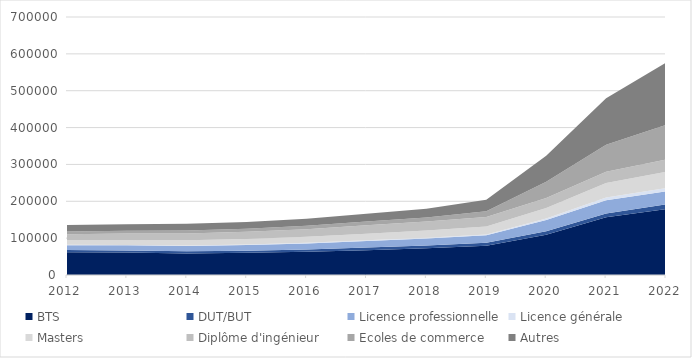
| Category | BTS | DUT/BUT | Licence professionnelle | Licence générale | Masters | Diplôme d'ingénieur | Ecoles de commerce | Autres |
|---|---|---|---|---|---|---|---|---|
| 2012 | 61769 | 5887 | 13387 | 1135 | 12676 | 15856 | 7310 | 17351 |
| 2013 | 60834 | 5836 | 13853 | 1182 | 13441 | 17351 | 7643 | 17872 |
| 2014 | 58620 | 5799 | 14452 | 1378 | 13784 | 18620 | 8305 | 17818 |
| 2015 | 60095 | 5918 | 15137 | 1475 | 14907 | 19620 | 8648 | 18213 |
| 2016 | 62830 | 6378 | 16041 | 2081 | 16165 | 20901 | 9379 | 18679 |
| 2017 | 67401 | 6900 | 17687 | 2322 | 17816 | 22544 | 10298 | 21336 |
| 2018 | 72608 | 7669 | 18571 | 2336 | 19394 | 24396 | 11222 | 23604 |
| 2019 | 79226 | 8144 | 20416 | 2435 | 21463 | 25602 | 15897 | 30663 |
| 2020 | 109500 | 9400 | 30200 | 4400 | 28200 | 27200 | 44200 | 70300 |
| 2021 | 156800 | 10300 | 35900 | 7200 | 39600 | 30000 | 73300 | 126600 |
| 2022 | 178900 | 12900 | 35400 | 8300 | 44800 | 32800 | 93900 | 169300 |